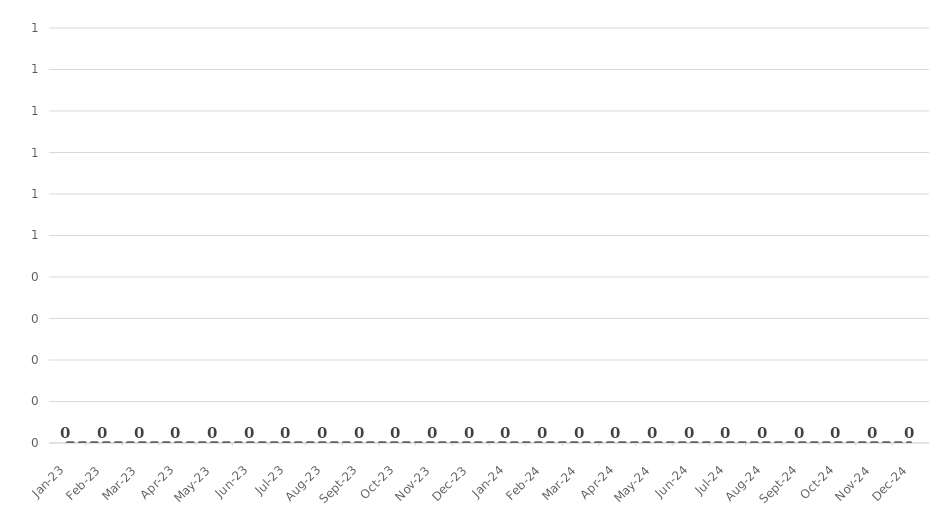
| Category | How big is your gap? |
|---|---|
| 2023-01-01 | 0 |
| 2023-02-01 | 0 |
| 2023-03-01 | 0 |
| 2023-04-01 | 0 |
| 2023-05-01 | 0 |
| 2023-06-01 | 0 |
| 2023-07-01 | 0 |
| 2023-08-01 | 0 |
| 2023-09-01 | 0 |
| 2023-10-01 | 0 |
| 2023-11-01 | 0 |
| 2023-12-01 | 0 |
| 2024-01-01 | 0 |
| 2024-02-01 | 0 |
| 2024-03-01 | 0 |
| 2024-04-01 | 0 |
| 2024-05-01 | 0 |
| 2024-06-01 | 0 |
| 2024-07-01 | 0 |
| 2024-08-01 | 0 |
| 2024-09-01 | 0 |
| 2024-10-01 | 0 |
| 2024-11-01 | 0 |
| 2024-12-01 | 0 |